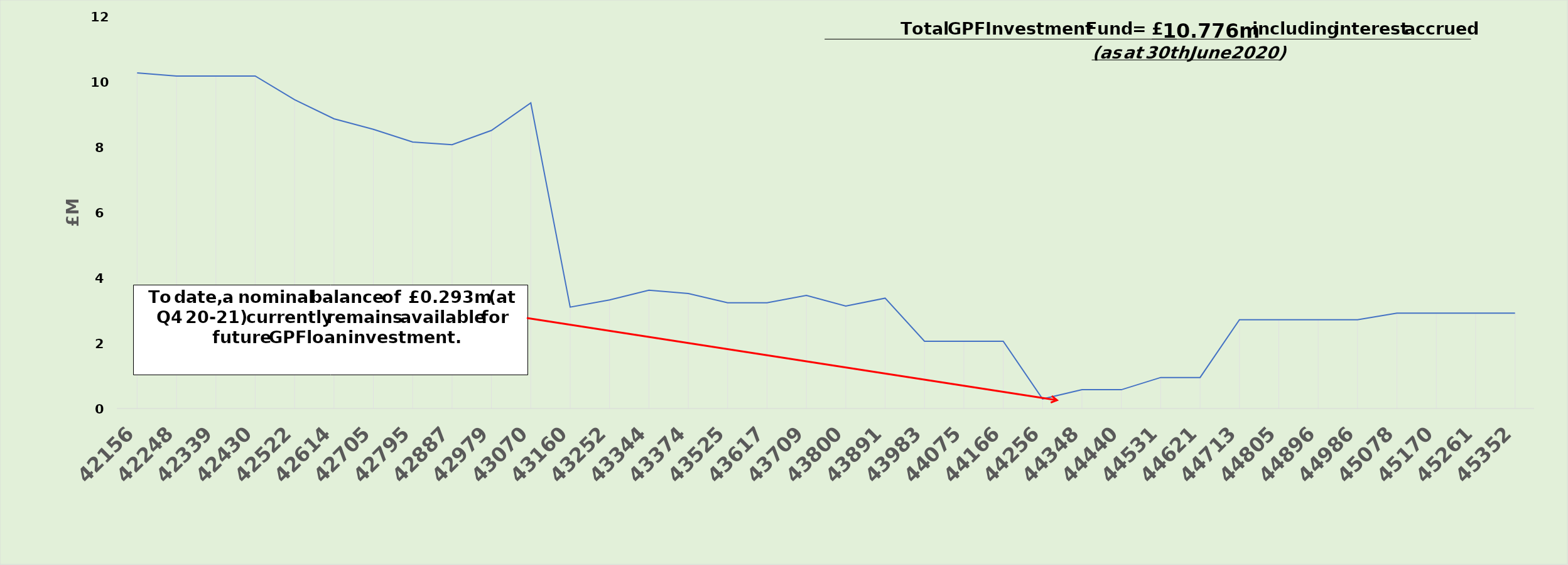
| Category | £m |
|---|---|
| 42156.0 | 10.287 |
| 42248.0 | 10.191 |
| 42339.0 | 10.191 |
| 42430.0 | 10.191 |
| 42522.0 | 9.464 |
| 42614.0 | 8.88 |
| 42705.0 | 8.558 |
| 42795.0 | 8.167 |
| 42887.0 | 8.084 |
| 42979.0 | 8.523 |
| 43070.0 | 9.365 |
| 43160.0 | 3.107 |
| 43252.0 | 3.327 |
| 43344.0 | 3.627 |
| 43374.0 | 3.526 |
| 43525.0 | 3.24 |
| 43617.0 | 3.24 |
| 43709.0 | 3.468 |
| 43800.0 | 3.138 |
| 43891.0 | 3.382 |
| 43983.0 | 2.062 |
| 44075.0 | 2.062 |
| 44166.0 | 2.062 |
| 44256.0 | 0.293 |
| 44348.0 | 0.576 |
| 44440.0 | 0.576 |
| 44531.0 | 0.951 |
| 44621.0 | 0.951 |
| 44713.0 | 2.721 |
| 44805.0 | 2.721 |
| 44896.0 | 2.721 |
| 44986.0 | 2.721 |
| 45078.0 | 2.921 |
| 45170.0 | 2.921 |
| 45261.0 | 2.921 |
| 45352.0 | 2.921 |